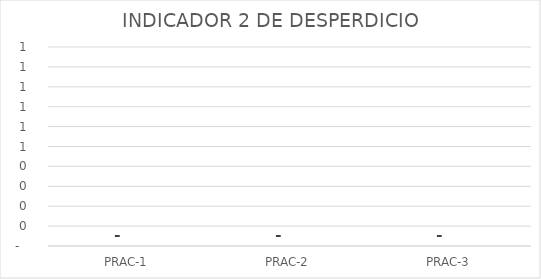
| Category | Series 0 |
|---|---|
| PRAC-1 | 0 |
| PRAC-2 | 0 |
| PRAC-3 | 0 |